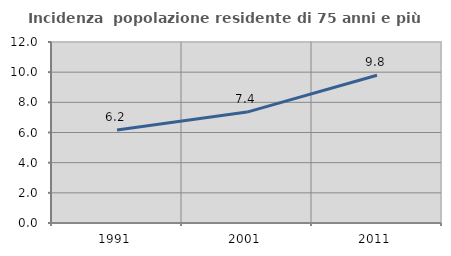
| Category | Incidenza  popolazione residente di 75 anni e più |
|---|---|
| 1991.0 | 6.166 |
| 2001.0 | 7.352 |
| 2011.0 | 9.791 |